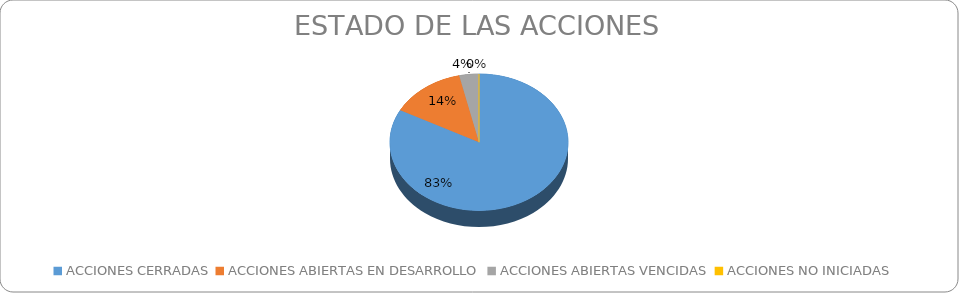
| Category | Series 0 |
|---|---|
| ACCIONES CERRADAS | 139 |
| ACCIONES ABIERTAS EN DESARROLLO | 23 |
| ACCIONES ABIERTAS VENCIDAS | 6 |
| ACCIONES NO INICIADAS | 0 |